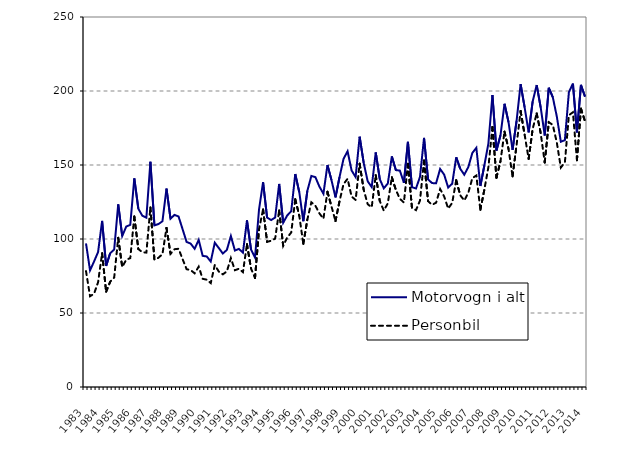
| Category | Motorvogn i alt | Personbil |
|---|---|---|
| 1983.0 | 97 | 78.3 |
| nan | 78.8 | 61.3 |
| nan | 84.8 | 63 |
| nan | 91.2 | 70.8 |
| 1984.0 | 112.2 | 90.4 |
| nan | 81.8 | 64.4 |
| nan | 90.4 | 71.1 |
| nan | 92.9 | 73.9 |
| 1985.0 | 123.4 | 100.8 |
| nan | 102 | 81.1 |
| nan | 108.4 | 86 |
| nan | 109.6 | 87.1 |
| 1986.0 | 141 | 115.2 |
| nan | 120.5 | 93.2 |
| nan | 115.7 | 91.1 |
| nan | 114.4 | 90.8 |
| 1987.0 | 152.2 | 121.3 |
| nan | 109.2 | 86.1 |
| nan | 110.1 | 87.3 |
| nan | 112 | 89.8 |
| 1988.0 | 134.1 | 107.5 |
| nan | 113.7 | 90 |
| nan | 116.3 | 93.1 |
| nan | 115.2 | 93.4 |
| 1989.0 | 106.6 | 86.4 |
| nan | 98 | 79.6 |
| nan | 96.9 | 79 |
| nan | 93.4 | 76.8 |
| 1990.0 | 99.4 | 81.3 |
| nan | 88.6 | 73.1 |
| nan | 88.2 | 72.5 |
| nan | 84.8 | 70.2 |
| 1991.0 | 97.5 | 82.4 |
| nan | 93.9 | 78 |
| nan | 90.2 | 76.1 |
| nan | 92.6 | 78.1 |
| 1992.0 | 102 | 87.1 |
| nan | 92.2 | 78.9 |
| nan | 93.3 | 79.9 |
| nan | 90.8 | 77.6 |
| 1993.0 | 112.6 | 96.5 |
| nan | 93 | 80.1 |
| nan | 87.5 | 73.6 |
| nan | 120.1 | 106.6 |
| 1994.0 | 138.4 | 120 |
| nan | 114.5 | 98.1 |
| nan | 112.8 | 98.8 |
| nan | 114.5 | 100.2 |
| 1995.0 | 137.2 | 119.3 |
| nan | 111 | 95.4 |
| nan | 115.9 | 101 |
| nan | 118.8 | 104.4 |
| 1996.0 | 143.9 | 126.9 |
| nan | 131.6 | 115.7 |
| nan | 112 | 96.7 |
| nan | 132.5 | 113.1 |
| 1997.0 | 142.6 | 124.8 |
| nan | 141.8 | 122.5 |
| nan | 135.4 | 117.3 |
| nan | 130.6 | 113.7 |
| 1998.0 | 150 | 131.9 |
| nan | 139.8 | 122 |
| nan | 128.1 | 112.1 |
| nan | 141.8 | 125.6 |
| 1999.0 | 154.2 | 137.1 |
| nan | 159.3 | 140.7 |
| nan | 146.3 | 128.7 |
| nan | 141.9 | 126.4 |
| 2000.0 | 169.1 | 150.9 |
| nan | 151.5 | 133.4 |
| nan | 139 | 123.5 |
| nan | 135.1 | 121.4 |
| 2001.0 | 158.5 | 143.1 |
| nan | 140.46 | 125.7 |
| nan | 134.24 | 119.2 |
| nan | 137.495 | 124.072 |
| 2002.0 | 155.814 | 141.724 |
| nan | 146.543 | 133.19 |
| nan | 146.231 | 127.141 |
| nan | 137.967 | 124.641 |
| 2003.0 | 165.679 | 150.811 |
| nan | 135.021 | 121.101 |
| nan | 134.111 | 119.491 |
| nan | 142.013 | 125.959 |
| 2004.0 | 168.309 | 153.043 |
| nan | 140.267 | 125.568 |
| nan | 137.77 | 123.121 |
| nan | 137.685 | 124.506 |
| 2005.0 | 147.311 | 133.756 |
| nan | 143.517 | 128.79 |
| nan | 134.783 | 120.571 |
| nan | 137.37 | 124.382 |
| 2006.0 | 155.213 | 139.728 |
| nan | 147.444 | 129.572 |
| nan | 143.451 | 126.006 |
| nan | 148.561 | 131.195 |
| 2007.0 | 158.1 | 141.084 |
| nan | 161.613 | 142.897 |
| nan | 135.821 | 119.753 |
| nan | 149.791 | 133.498 |
| 2008.0 | 164.642 | 148.614 |
| nan | 197.287 | 175.714 |
| nan | 159.718 | 141.407 |
| nan | 170.057 | 152.54 |
| 2009.0 | 191.38 | 172.559 |
| nan | 178.906 | 160.765 |
| nan | 160.234 | 142.312 |
| nan | 179.857 | 163.532 |
| 2010.0 | 204.636 | 186.507 |
| nan | 188.957 | 170.463 |
| nan | 172.077 | 154.156 |
| nan | 192.961 | 174.399 |
| 2011.0 | 204.005 | 184.86 |
| nan | 188.741 | 171.333 |
| nan | 169.934 | 151.694 |
| nan | 202.176 | 178.919 |
| 2012.0 | 195.829 | 177.072 |
| nan | 182.751 | 165.128 |
| nan | 165.73 | 148.242 |
| nan | 166.805 | 151.728 |
| 2013.0 | 199.181 | 183.653 |
| nan | 205.015 | 185.634 |
| nan | 172.044 | 153.21 |
| nan | 204.1 | 188.079 |
| 2014.0 | 196.177 | 179.552 |